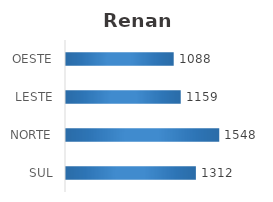
| Category | Series 0 |
|---|---|
| SUL | 1312 |
| NORTE | 1548 |
| LESTE | 1159 |
| OESTE | 1088 |